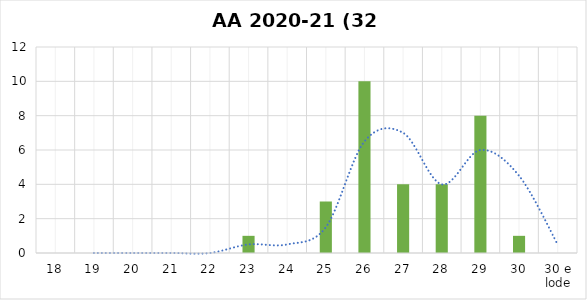
| Category | Series 0 |
|---|---|
| 18 | 0 |
| 19 | 0 |
| 20 | 0 |
| 21 | 0 |
| 22 | 0 |
| 23 | 1 |
| 24 | 0 |
| 25 | 3 |
| 26 | 10 |
| 27 | 4 |
| 28 | 4 |
| 29 | 8 |
| 30 | 1 |
| 30 e lode | 0 |